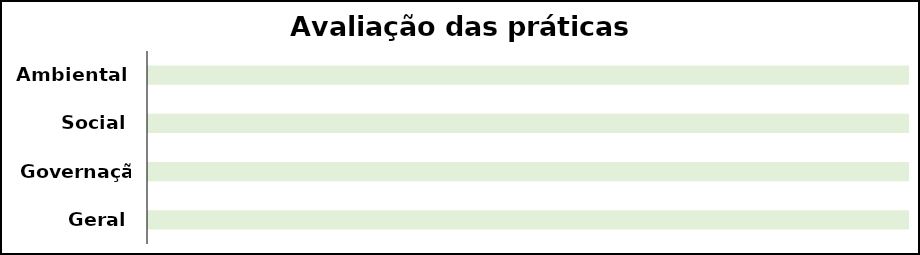
| Category | Score | Aux |
|---|---|---|
| Geral | 0 | 16 |
| Governação | 0 | 10 |
| Social | 0 | 10 |
| Ambiental | 0 | 14 |